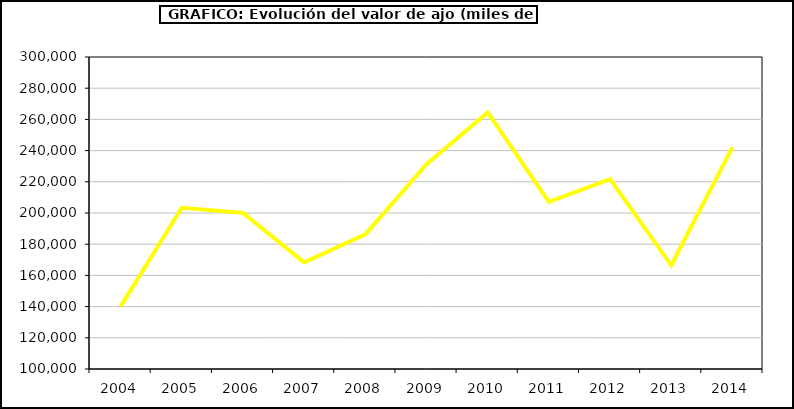
| Category | Valor |
|---|---|
| 0 | 140137.36 |
| 1 | 203360.891 |
| 2 | 200088.341 |
| 3 | 168388.683 |
| 4 | 186354.628 |
| 5 | 231334.334 |
| 6 | 264505.874 |
| 7 | 207093.401 |
| 8 | 221679.276 |
| 9 | 166479.754 |
| 10 | 242093 |